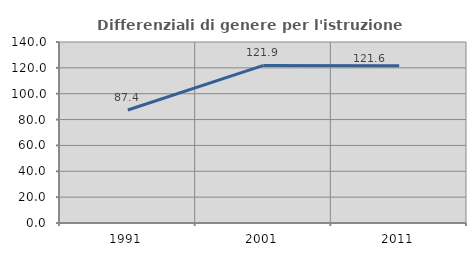
| Category | Differenziali di genere per l'istruzione superiore |
|---|---|
| 1991.0 | 87.434 |
| 2001.0 | 121.893 |
| 2011.0 | 121.611 |